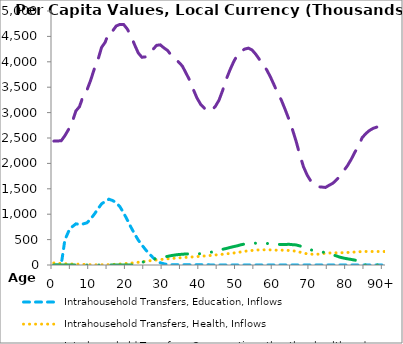
| Category | Intrahousehold Transfers, Education, Inflows | Intrahousehold Transfers, Health, Inflows | Intrahousehold Transfers, Consumption other than health and education, Inflows | Intrahousehold Transfers, Saving, Inflows |
|---|---|---|---|---|
| 0 | 0 | 40735.542 | 2438635.553 | 0 |
|  | 0 | 34636.37 | 2442288.473 | 0 |
| 2 | 0 | 28650.706 | 2444979.865 | 0 |
| 3 | 491476.521 | 24467.449 | 2544054.768 | 0 |
| 4 | 658670.876 | 21498.93 | 2667403.624 | 0 |
| 5 | 751806.116 | 19682.477 | 2810039.2 | 0 |
| 6 | 810243.366 | 18393.193 | 3031755.211 | 0 |
| 7 | 799542.942 | 15466.92 | 3117837.005 | 0 |
| 8 | 808842.303 | 12334.03 | 3330290.324 | 0 |
| 9 | 830247.656 | 9222.898 | 3440291.362 | 0 |
| 10 | 901753.601 | 6513.899 | 3629881.107 | 0 |
| 11 | 997409.624 | 4999.745 | 3854778.203 | 0 |
| 12 | 1100862.478 | 4283.806 | 4034395.563 | 0 |
| 13 | 1203382.663 | 4515.708 | 4282718.993 | 0 |
| 14 | 1251826.385 | 5687.058 | 4385979.438 | 0 |
| 15 | 1295419.203 | 7798.353 | 4586958.933 | 0 |
| 16 | 1269564.381 | 10822.013 | 4605957.765 | 0 |
| 17 | 1226374.938 | 14357.16 | 4705291.147 | 0 |
| 18 | 1147135.329 | 19667.812 | 4736458.352 | 0 |
| 19 | 1027899.854 | 25145.097 | 4736216.871 | 0 |
| 20 | 889380.423 | 31000.224 | 4646155.752 | 0 |
| 21 | 745312.796 | 36417.504 | 4511732.156 | 0 |
| 22 | 613239.236 | 44516.581 | 4336313.626 | 0 |
| 23 | 491342.259 | 53082.397 | 4174012.321 | 37164.333 |
| 24 | 393541.284 | 62355.921 | 4089541.751 | 52398.765 |
| 25 | 300627.837 | 71929.516 | 4097229.402 | 72298.442 |
| 26 | 220424.452 | 82225.438 | 4138959.867 | 94792.081 |
| 27 | 146434.805 | 91251.599 | 4243473.481 | 111559.264 |
| 28 | 86836.726 | 99312.229 | 4324033.057 | 127637.016 |
| 29 | 44156.131 | 106818.933 | 4333798.994 | 143764.256 |
| 30 | 22672.374 | 114502.924 | 4273688.705 | 158555.622 |
| 31 | 9114.713 | 121240.587 | 4222637.367 | 170010.958 |
| 32 | 4780.046 | 128572.206 | 4128090.245 | 185048.635 |
| 33 | 3932.531 | 134253.987 | 4061153.039 | 196450.082 |
| 34 | 4268.673 | 139731.65 | 3994811.894 | 206500.768 |
| 35 | 4755.593 | 144235.159 | 3917524.241 | 211151.381 |
| 36 | 4375.418 | 149581.31 | 3780069.139 | 217776.718 |
| 37 | 3680.568 | 154252.557 | 3637882.414 | 218500.761 |
| 38 | 3526.489 | 159765.99 | 3455756.145 | 218267.715 |
| 39 | 3632.244 | 165043.636 | 3287291.744 | 218507.225 |
| 40 | 3874.844 | 171472.91 | 3162825.77 | 222397.649 |
| 41 | 3896.82 | 177288.65 | 3087049.077 | 226793.059 |
| 42 | 4068.302 | 183489.334 | 3030880.565 | 239314.667 |
| 43 | 0 | 190082.521 | 3043671.479 | 254684.805 |
| 44 | 0 | 197129.905 | 3121909.722 | 273524.324 |
| 45 | 0 | 204328.913 | 3244307.712 | 293300.009 |
| 46 | 0 | 212202.656 | 3436757.526 | 309710.61 |
| 47 | 0 | 219366.124 | 3660316.74 | 325443.98 |
| 48 | 0 | 227170.184 | 3841702.927 | 344883.914 |
| 49 | 0 | 236820.991 | 4002676.825 | 362249.033 |
| 50 | 0 | 245724.11 | 4131987.059 | 377809.237 |
| 51 | 0 | 257243.208 | 4207458.515 | 398984.206 |
| 52 | 0 | 269444.615 | 4250581.485 | 412703.439 |
| 53 | 0 | 279512.272 | 4268368.183 | 420706.893 |
| 54 | 0 | 286465.331 | 4233136.802 | 422796.654 |
| 55 | 0 | 295121.345 | 4150405.157 | 429947.427 |
| 56 | 0 | 296807.485 | 4048201.865 | 427799.07 |
| 57 | 0 | 297955.823 | 3936228.627 | 427180.023 |
| 58 | 0 | 299252.686 | 3841102.487 | 424502.269 |
| 59 | 0 | 297606.297 | 3703600.888 | 419019.223 |
| 60 | 0 | 293377.631 | 3545486.21 | 412790.46 |
| 61 | 0 | 291792.569 | 3385000.426 | 406619.122 |
| 62 | 0 | 291997.419 | 3243306.706 | 404112.973 |
| 63 | 0 | 289286.692 | 3065861.534 | 402890.174 |
| 64 | 0 | 286367.86 | 2877350.067 | 407751.983 |
| 65 | 0 | 280324.01 | 2669645.083 | 400488.237 |
| 66 | 0 | 271447.861 | 2438046.519 | 395199.323 |
| 67 | 0 | 253932.067 | 2175389.299 | 375997.511 |
| 68 | 0 | 235630.364 | 1937225.254 | 348923.524 |
| 69 | 0 | 220428.242 | 1772609.486 | 320626.786 |
| 70 | 0 | 213484.458 | 1653983.651 | 298082.934 |
| 71 | 0 | 210514.836 | 1588672.576 | 278375.313 |
| 72 | 0 | 213155.703 | 1540266.436 | 265453.924 |
| 73 | 0 | 221611.685 | 1534472.259 | 258186.05 |
| 74 | 0 | 232018.195 | 1526595.659 | 242460.397 |
| 75 | 0 | 236084.272 | 1569691.146 | 224416.645 |
| 76 | 0 | 237484.846 | 1608405.144 | 200682.506 |
| 77 | 0 | 240014.161 | 1674871.249 | 177849.622 |
| 78 | 0 | 241108.085 | 1752431.768 | 152748.995 |
| 79 | 0 | 242971.281 | 1857460.637 | 135758.436 |
| 80 | 0 | 246083.627 | 1955114.934 | 121862.059 |
| 81 | 0 | 250857.889 | 2077235.222 | 109701.098 |
| 82 | 0 | 255247.82 | 2217986.305 | 95892.228 |
| 83 | 0 | 258221.979 | 2339167.816 | 85930.821 |
| 84 | 0 | 267104.192 | 2505673.149 | 0 |
| 85 | 0 | 266311.588 | 2586890.231 | 0 |
| 86 | 0 | 265490.997 | 2648164.637 | 0 |
| 87 | 0 | 265285.18 | 2690132.866 | 0 |
| 88 | 0 | 265121.226 | 2714634.403 | 0 |
| 89 | 0 | 265368.1 | 2735434.164 | 0 |
| 90+ | 0 | 265633.784 | 2756215.115 | 0 |